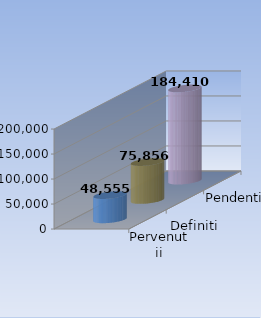
| Category | Pervenutii | Definiti | Pendenti |
|---|---|---|---|
| 0 | 48555 | 75856 | 184410 |